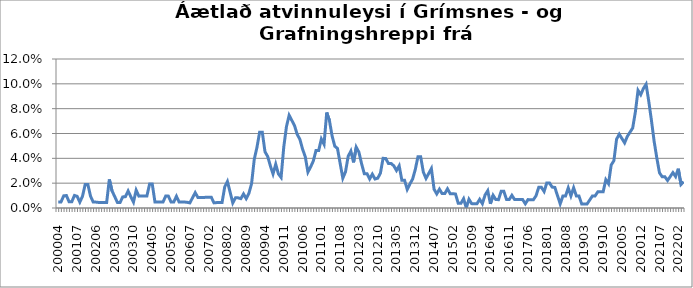
| Category | Series 0 |
|---|---|
| 200004 | 0.005 |
| 200005 | 0.005 |
| 200006 | 0.01 |
| 200007 | 0.01 |
| 200011 | 0.005 |
| 200012 | 0.005 |
| 200106 | 0.01 |
| 200107 | 0.009 |
| 200108 | 0.005 |
| 200112 | 0.009 |
| 200201 | 0.019 |
| 200202 | 0.019 |
| 200203 | 0.009 |
| 200204 | 0.005 |
| 200206 | 0.005 |
| 200207 | 0.004 |
| 200210 | 0.004 |
| 200211 | 0.004 |
| 200212 | 0.004 |
| 200301 | 0.023 |
| 200302 | 0.014 |
| 200303 | 0.009 |
| 200304 | 0.004 |
| 200305 | 0.004 |
| 200306 | 0.009 |
| 200307 | 0.009 |
| 200308 | 0.014 |
| 200309 | 0.009 |
| 200310 | 0.005 |
| 200311 | 0.014 |
| 200312 | 0.01 |
| 200401 | 0.01 |
| 200402 | 0.01 |
| 200403 | 0.01 |
| 200404 | 0.019 |
| 200405 | 0.019 |
| 200406 | 0.005 |
| 200409 | 0.005 |
| 200410 | 0.005 |
| 200411 | 0.005 |
| 200412 | 0.01 |
| 200501 | 0.01 |
| 200502 | 0.005 |
| 200503 | 0.005 |
| 200504 | 0.009 |
| 200512 | 0.005 |
| 200602 | 0.005 |
| 200603 | 0.005 |
| 200606 | 0.005 |
| 200607 | 0.004 |
| 200608 | 0.008 |
| 200609 | 0.012 |
| 200610 | 0.009 |
| 200611 | 0.009 |
| 200612 | 0.009 |
| 200701 | 0.009 |
| 200702 | 0.009 |
| 200703 | 0.009 |
| 200704 | 0.004 |
| 200710 | 0.004 |
| 200711 | 0.004 |
| 200712 | 0.004 |
| 200801 | 0.017 |
| 200802 | 0.021 |
| 200803 | 0.013 |
| 200804 | 0.004 |
| 200805 | 0.008 |
| 200806 | 0.008 |
| 200807 | 0.008 |
| 200808 | 0.011 |
| 200809 | 0.008 |
| 200810 | 0.012 |
| 200811 | 0.02 |
| 200812 | 0.039 |
| 200901 | 0.049 |
| 200902 | 0.061 |
| 200903 | 0.061 |
| 200904 | 0.045 |
| 200905 | 0.042 |
| 200906 | 0.034 |
| 200907 | 0.027 |
| 200908 | 0.035 |
| 200909 | 0.027 |
| 200910 | 0.025 |
| 200911 | 0.049 |
| 200912 | 0.066 |
| 201001 | 0.075 |
| 201002 | 0.071 |
| 201003 | 0.066 |
| 201004 | 0.059 |
| 201005 | 0.055 |
| 201006 | 0.047 |
| 201007 | 0.041 |
| 201008 | 0.029 |
| 201009 | 0.033 |
| 201010 | 0.038 |
| 201011 | 0.046 |
| 201012 | 0.046 |
| 201101 | 0.056 |
| 201102 | 0.051 |
| 201103 | 0.077 |
| 201104 | 0.071 |
| 201105 | 0.058 |
| 201106 | 0.05 |
| 201107 | 0.048 |
| 201108 | 0.036 |
| 201109 | 0.024 |
| 201110 | 0.029 |
| 201111 | 0.042 |
| 201112 | 0.046 |
| 201201 | 0.037 |
| 201202 | 0.049 |
| 201203 | 0.045 |
| 201204 | 0.036 |
| 201205 | 0.028 |
| 201206 | 0.028 |
| 201207 | 0.023 |
| 201208 | 0.027 |
| 201209 | 0.023 |
| 201210 | 0.024 |
| 201211 | 0.028 |
| 201212 | 0.04 |
| 201301 | 0.04 |
| 201302 | 0.036 |
| 201303 | 0.036 |
| 201304 | 0.034 |
| 201305 | 0.03 |
| 201306 | 0.034 |
| 201307 | 0.022 |
| 201308 | 0.022 |
| 201309 | 0.015 |
| 201310 | 0.019 |
| 201311 | 0.023 |
| 201312 | 0.031 |
| 201401 | 0.041 |
| 201402 | 0.041 |
| 201403 | 0.029 |
| 201404 | 0.024 |
| 201405 | 0.028 |
| 201406 | 0.032 |
| 201407 | 0.015 |
| 201408 | 0.011 |
| 201409 | 0.015 |
| 201410 | 0.012 |
| 201411 | 0.012 |
| 201412 | 0.015 |
| 201501 | 0.012 |
| 201502 | 0.012 |
| 201503 | 0.011 |
| 201504 | 0.004 |
| 201505 | 0.004 |
| 201506 | 0.007 |
| 201507 | 0 |
| 201508 | 0.007 |
| 201509 | 0.004 |
| 201510 | 0.003 |
| 201511 | 0.003 |
| 201512 | 0.007 |
| 201601 | 0.003 |
| 201602 | 0.01 |
| 201603 | 0.014 |
| 201604 | 0.003 |
| 201605 | 0.01 |
| 201606 | 0.007 |
| 201607 | 0.007 |
| 201608 | 0.013 |
| 201609 | 0.013 |
| 201610 | 0.007 |
| 201611 | 0.007 |
| 201612 | 0.01 |
| 201701 | 0.007 |
| 201702 | 0.007 |
| 201703 | 0.007 |
| 201704 | 0.007 |
| 201705 | 0.003 |
| 201706 | 0.007 |
| 201707 | 0.007 |
| 201708 | 0.007 |
| 201709 | 0.01 |
| 201710 | 0.017 |
| 201711 | 0.017 |
| 201712 | 0.013 |
| 201801 | 0.02 |
| 201802 | 0.02 |
| 201803 | 0.017 |
| 201804 | 0.017 |
| 201805 | 0.01 |
| 201806 | 0.003 |
| 201807 | 0.01 |
| 201808 | 0.01 |
| 201809 | 0.016 |
| 201810 | 0.01 |
| 201811 | 0.016 |
| 201812 | 0.01 |
| 201901 | 0.01 |
| 201902 | 0.003 |
| 201903 | 0.003 |
| 201904 | 0.003 |
| 201905 | 0.006 |
| 201906 | 0.01 |
| 201907 | 0.01 |
| 201908 | 0.013 |
| 201909 | 0.013 |
| 201910 | 0.013 |
| 201911 | 0.023 |
| 201912 | 0.02 |
| 202001 | 0.035 |
| 202002 | 0.038 |
| 202003 | 0.055 |
| 202004 | 0.059 |
| 202005 | 0.056 |
| 202006 | 0.052 |
| 202007 | 0.058 |
| 202008 | 0.061 |
| 202009 | 0.064 |
| 202010 | 0.077 |
| 202011 | 0.095 |
| 202012 | 0.091 |
| 202101 | 0.096 |
| 202102 | 0.1 |
| 202103 | 0.086 |
| 202104 | 0.07 |
| 202105 | 0.054 |
| 202106 | 0.04 |
| 202107 | 0.028 |
| 202108 | 0.025 |
| 202109 | 0.025 |
| 202110 | 0.022 |
| 202111 | 0.025 |
| 202112 | 0.028 |
| 202201 | 0.025 |
| 202202 | 0.032 |
| 202203 | 0.019 |
| 202204 | 0.021 |